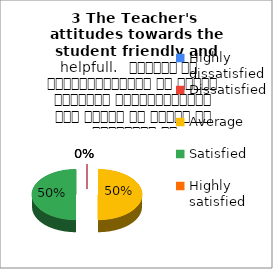
| Category | 3 The Teacher's  attitudes towards the student friendly and helpfull.   शिक्षक का विद्यार्थियों के प्रति व्यवहार मित्रतापूर्ण एवम सहयोग के भावना से परिपूर्ण था |
|---|---|
| Highly dissatisfied | 0 |
| Dissatisfied | 0 |
| Average | 4 |
| Satisfied | 4 |
| Highly satisfied | 0 |